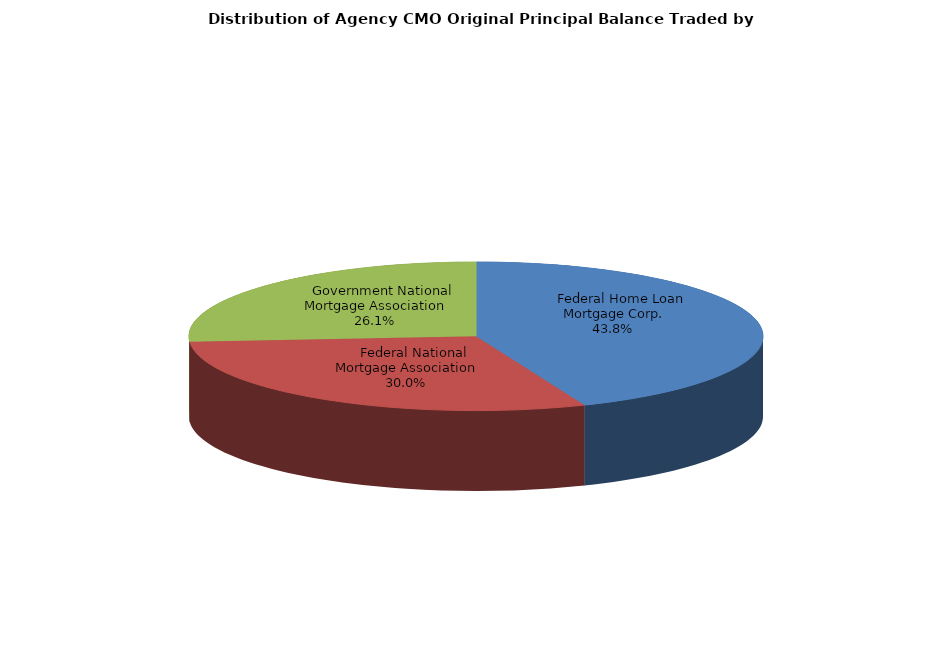
| Category | Series 0 |
|---|---|
|     Federal Home Loan Mortgage Corp. | 2700448922.057 |
|     Federal National Mortgage Association | 1848345121.803 |
|     Government National Mortgage Association | 1610281091.991 |